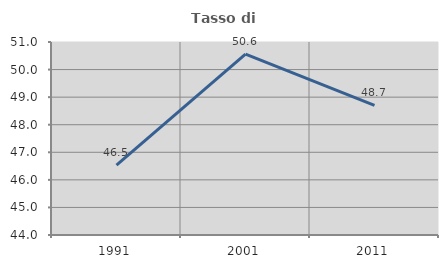
| Category | Tasso di occupazione   |
|---|---|
| 1991.0 | 46.535 |
| 2001.0 | 50.563 |
| 2011.0 | 48.704 |